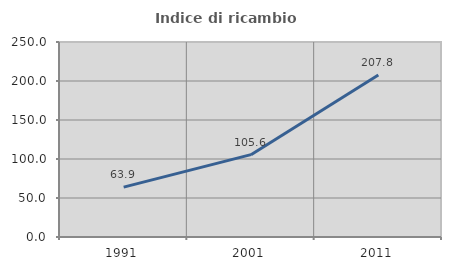
| Category | Indice di ricambio occupazionale  |
|---|---|
| 1991.0 | 63.924 |
| 2001.0 | 105.556 |
| 2011.0 | 207.812 |